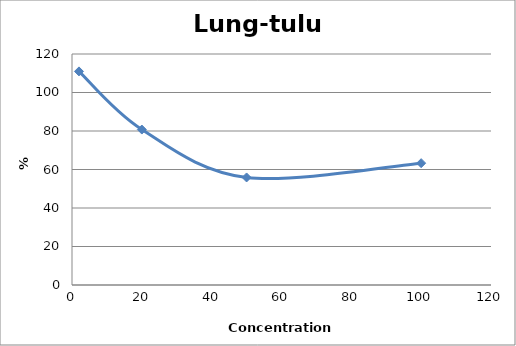
| Category | Lung-tulu4 |
|---|---|
| 100.0 | 63.288 |
| 50.0 | 55.862 |
| 20.0 | 80.749 |
| 2.0 | 110.959 |
| nan | 0 |
| nan | 0 |
| nan | 0 |
| nan | 0 |
| nan | 0 |